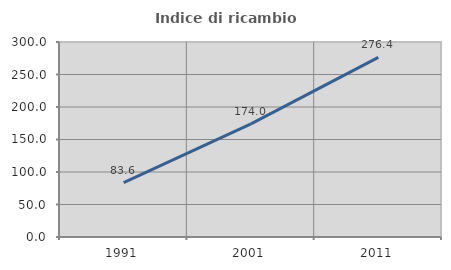
| Category | Indice di ricambio occupazionale  |
|---|---|
| 1991.0 | 83.618 |
| 2001.0 | 173.958 |
| 2011.0 | 276.404 |